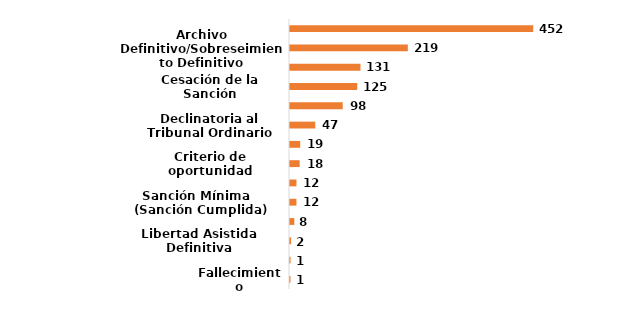
| Category | Series 0 |
|---|---|
| Fallecimiento | 0.001 |
| Cumplimiento Especial de la Sanción Definitivo | 0.001 |
| Libertad Asistida Definitiva | 0.002 |
| Traslados Otorgados Fuera de la Jurisdicción | 0.007 |
| Sanción Mínima   (Sanción Cumplida) | 0.01 |
| Nulidad del Procedimiento | 0.01 |
| Criterio de oportunidad | 0.016 |
| Prescripción | 0.017 |
| Declinatoria al Tribunal Ordinario | 0.041 |
| Descargo | 0.086 |
| Cesación de la Sanción | 0.109 |
| Auto de No Ha Lugar | 0.114 |
| Archivo Definitivo/Sobreseimiento Definitivo | 0.191 |
| Extinción | 0.395 |